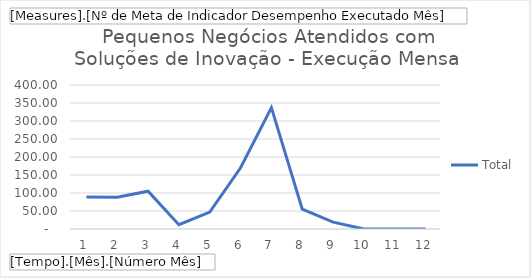
| Category | Total |
|---|---|
| 1 | 89 |
| 2 | 88 |
| 3 | 105 |
| 4 | 12 |
| 5 | 47 |
| 6 | 170 |
| 7 | 337 |
| 8 | 55 |
| 9 | 19 |
| 10 | 0 |
| 11 | 0 |
| 12 | 0 |